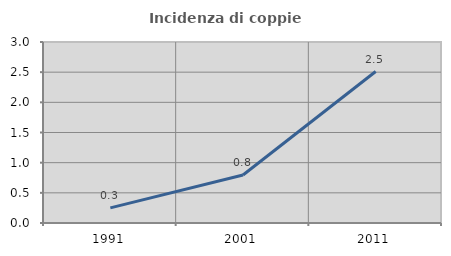
| Category | Incidenza di coppie miste |
|---|---|
| 1991.0 | 0.25 |
| 2001.0 | 0.796 |
| 2011.0 | 2.51 |